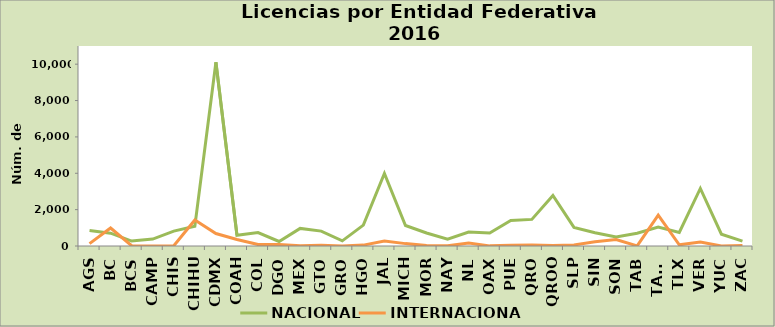
| Category | NACIONAL | INTERNACIONAL |
|---|---|---|
| AGS | 856 | 129 |
| BC | 706 | 990 |
| BCS | 272 | 14 |
| CAMP | 380 | 1 |
| CHIS | 817 | 11 |
| CHIHU | 1089 | 1425 |
| CDMX | 10104 | 687 |
| COAH | 593 | 361 |
| COL | 740 | 79 |
| DGO | 250 | 79 |
| MEX | 967 | 19 |
| GTO | 819 | 40 |
| GRO | 283 | 4 |
| HGO | 1148 | 49 |
| JAL | 3991 | 279 |
| MICH | 1130 | 131 |
| MOR | 717 | 23 |
| NAY | 380 | 10 |
| NL | 770 | 161 |
| OAX | 716 | 7 |
| PUE | 1401 | 41 |
| QRO | 1464 | 53 |
| QROO | 2783 | 30 |
| SLP | 1022 | 58 |
| SIN | 733 | 229 |
| SON | 490 | 360 |
| TAB | 706 | 5 |
| TAMS | 1036 | 1701 |
| TLX | 747 | 65 |
| VER | 3165 | 218 |
| YUC | 651 | 2 |
| ZAC | 264 | 21 |